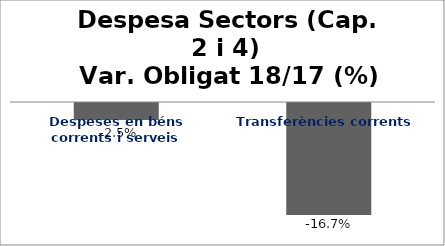
| Category | Series 0 |
|---|---|
| Despeses en béns corrents i serveis | -0.025 |
| Transferències corrents | -0.167 |